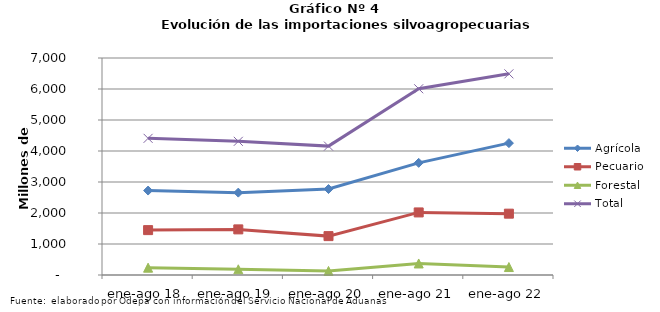
| Category | Agrícola | Pecuario | Forestal | Total |
|---|---|---|---|---|
| ene-ago 18 | 2724116 | 1448047 | 236334 | 4408497 |
| ene-ago 19 | 2656963 | 1471476 | 184027 | 4312466 |
| ene-ago 20 | 2772739 | 1254385 | 130570 | 4157694 |
| ene-ago 21 | 3617836 | 2018614 | 371578 | 6008028 |
| ene-ago 22 | 4253656 | 1978340 | 256644 | 6488640 |